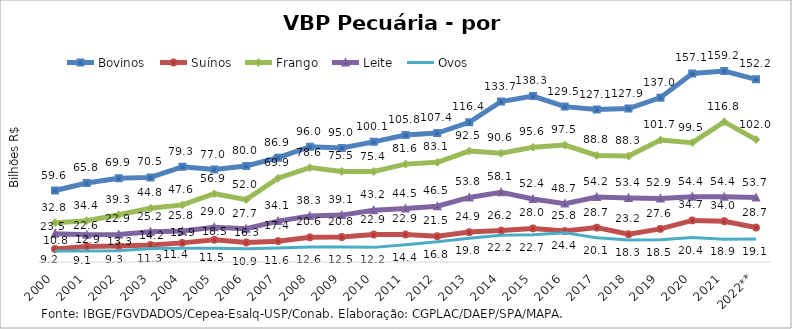
| Category | Bovinos | Suínos | Frango | Leite | Ovos |
|---|---|---|---|---|---|
| 2000 | 59.563 | 10.785 | 32.775 | 23.527 | 9.199 |
| 2001 | 65.842 | 12.939 | 34.449 | 22.64 | 9.065 |
| 2002 | 69.871 | 13.261 | 39.322 | 22.924 | 9.339 |
| 2003 | 70.518 | 14.173 | 44.831 | 25.245 | 11.297 |
| 2004 | 79.341 | 15.935 | 47.604 | 25.801 | 11.45 |
| 2005 | 77.028 | 18.475 | 56.914 | 29.019 | 11.527 |
| 2006 | 79.974 | 16.251 | 51.994 | 27.718 | 10.95 |
| 2007 | 86.914 | 17.378 | 69.859 | 34.075 | 11.637 |
| 2008 | 95.963 | 20.577 | 78.638 | 38.333 | 12.568 |
| 2009 | 94.962 | 20.8 | 75.504 | 39.081 | 12.532 |
| 2010 | 100.119 | 22.882 | 75.413 | 43.159 | 12.188 |
| 2011 | 105.841 | 22.918 | 81.562 | 44.492 | 14.362 |
| 2012 | 107.419 | 21.519 | 83.085 | 46.493 | 16.836 |
| 2013 | 116.404 | 24.916 | 92.474 | 53.801 | 19.801 |
| 2014 | 133.727 | 26.17 | 90.604 | 58.098 | 22.247 |
| 2015 | 138.329 | 27.967 | 95.649 | 52.443 | 22.652 |
| 2016 | 129.483 | 25.81 | 97.46 | 48.661 | 24.42 |
| 2017 | 127.065 | 28.651 | 88.769 | 54.219 | 20.129 |
| 2018 | 127.916 | 23.203 | 88.285 | 53.413 | 18.304 |
| 2019 | 136.97 | 27.58 | 101.652 | 52.918 | 18.537 |
| 2020 | 157.113 | 34.668 | 99.453 | 54.407 | 20.358 |
| 2021 | 159.184 | 33.992 | 116.826 | 54.375 | 18.904 |
| 2022** | 152.213 | 28.742 | 101.995 | 53.654 | 19.092 |